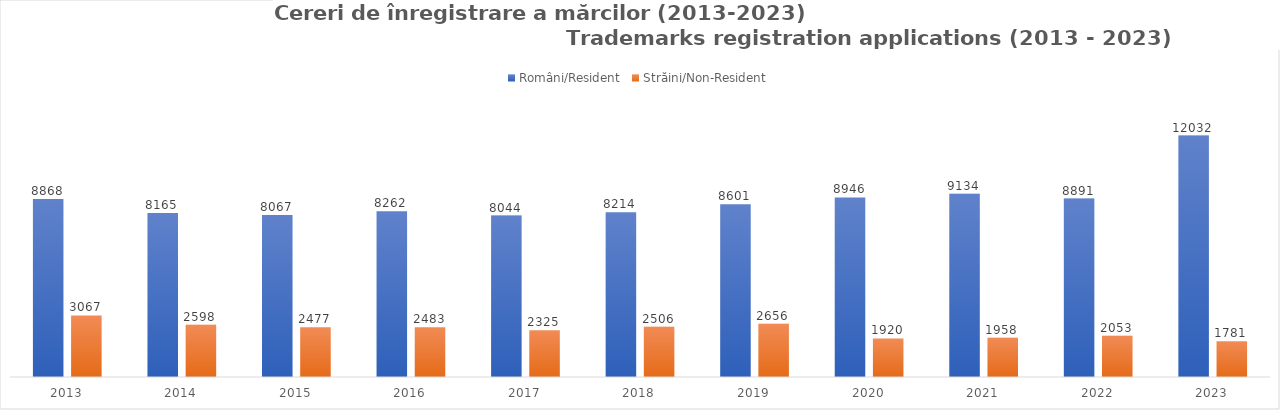
| Category | Români/Resident | Străini/Non-Resident |
|---|---|---|
| 2013.0 | 8868 | 3067 |
| 2014.0 | 8165 | 2598 |
| 2015.0 | 8067 | 2477 |
| 2016.0 | 8262 | 2483 |
| 2017.0 | 8044 | 2325 |
| 2018.0 | 8214 | 2506 |
| 2019.0 | 8601 | 2656 |
| 2020.0 | 8946 | 1920 |
| 2021.0 | 9134 | 1958 |
| 2022.0 | 8891 | 2053 |
| 2023.0 | 12032 | 1781 |